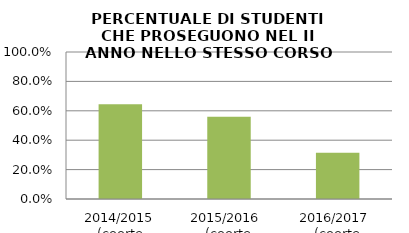
| Category | 2014/2015 (coorte 2013/14) 2015/2016  (coorte 2014/15) 2016/2017  (coorte 2015/16) |
|---|---|
| 2014/2015 (coorte 2013/14) | 0.645 |
| 2015/2016  (coorte 2014/15) | 0.559 |
| 2016/2017  (coorte 2015/16) | 0.315 |